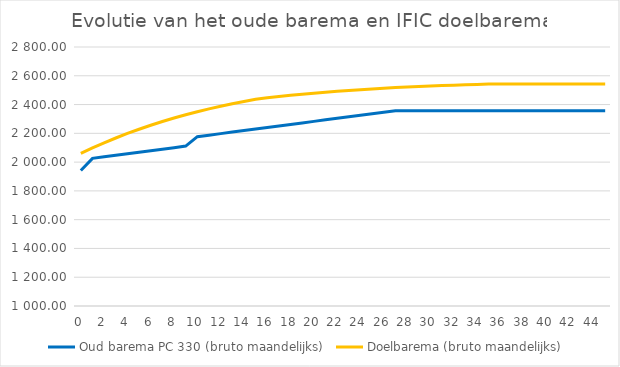
| Category | Oud barema PC 330 (bruto maandelijks) | Doelbarema | Doelbarema (bruto maandelijks) |
|---|---|---|---|
| 0.0 | 1941.79 |  | 2060.66 |
| 1.0 | 2026.07 |  | 2098.47 |
| 2.0 | 2036.72 |  | 2134.08 |
| 3.0 | 2047.36 |  | 2167.58 |
| 4.0 | 2058 |  | 2199.06 |
| 5.0 | 2068.64 |  | 2228.6 |
| 6.0 | 2079.28 |  | 2256.28 |
| 7.0 | 2089.93 |  | 2282.21 |
| 8.0 | 2100.57 |  | 2306.46 |
| 9.0 | 2111.21 |  | 2329.14 |
| 10.0 | 2176.74 |  | 2350.32 |
| 11.0 | 2187.38 |  | 2370.1 |
| 12.0 | 2198.02 |  | 2388.53 |
| 13.0 | 2208.67 |  | 2405.72 |
| 14.0 | 2219.31 |  | 2421.74 |
| 15.0 | 2229.95 |  | 2436.66 |
| 16.0 | 2240.59 |  | 2446.52 |
| 17.0 | 2251.24 |  | 2455.67 |
| 18.0 | 2261.88 |  | 2464.17 |
| 19.0 | 2272.52 |  | 2472.06 |
| 20.0 | 2283.17 |  | 2479.39 |
| 21.0 | 2293.81 |  | 2486.18 |
| 22.0 | 2304.45 |  | 2492.47 |
| 23.0 | 2315.09 |  | 2498.32 |
| 24.0 | 2325.74 |  | 2503.74 |
| 25.0 | 2336.38 |  | 2508.77 |
| 26.0 | 2347.02 |  | 2513.42 |
| 27.0 | 2357.67 |  | 2517.73 |
| 28.0 | 2357.67 |  | 2521.73 |
| 29.0 | 2357.67 |  | 2525.43 |
| 30.0 | 2357.67 |  | 2528.87 |
| 31.0 | 2357.67 |  | 2532.04 |
| 32.0 | 2357.67 |  | 2534.98 |
| 33.0 | 2357.67 |  | 2537.71 |
| 34.0 | 2357.67 |  | 2540.23 |
| 35.0 | 2357.67 |  | 2542.57 |
| 36.0 | 2357.67 |  | 2542.57 |
| 37.0 | 2357.67 |  | 2542.57 |
| 38.0 | 2357.67 |  | 2542.57 |
| 39.0 | 2357.67 |  | 2542.57 |
| 40.0 | 2357.67 |  | 2542.57 |
| 41.0 | 2357.67 |  | 2542.57 |
| 42.0 | 2357.67 |  | 2542.57 |
| 43.0 | 2357.67 |  | 2542.57 |
| 44.0 | 2357.67 |  | 2542.57 |
| 45.0 | 2357.67 |  | 2542.57 |